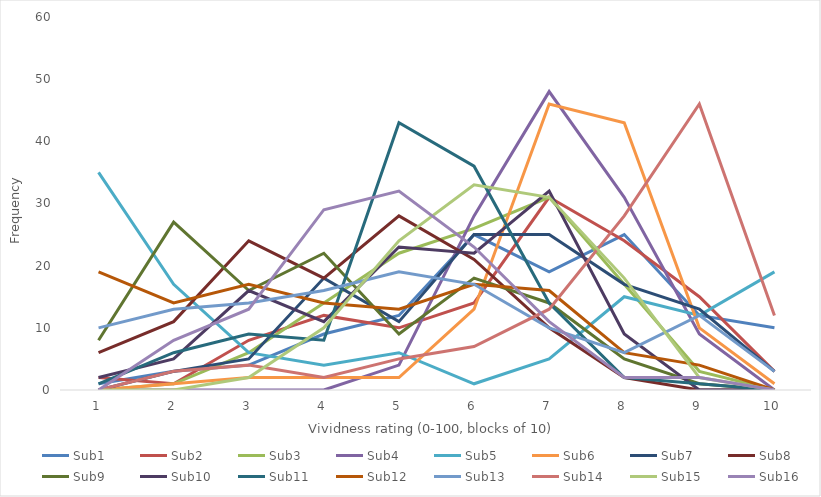
| Category | Sub1 | Sub2 | Sub3 | Sub4 | Sub5 | Sub6 | Sub7 | Sub8 | Sub9 | Sub10 | Sub11 | Sub12 | Sub13 | Sub14 | Sub15 | Sub16 |
|---|---|---|---|---|---|---|---|---|---|---|---|---|---|---|---|---|
| 0 | 1 | 2 | 0 | 0 | 35 | 0 | 0 | 6 | 8 | 2 | 1 | 19 | 10 | 0 | 0 | 0 |
| 1 | 3 | 1 | 1 | 0 | 17 | 1 | 3 | 11 | 27 | 5 | 6 | 14 | 13 | 3 | 0 | 8 |
| 2 | 4 | 8 | 6 | 0 | 6 | 2 | 5 | 24 | 16 | 16 | 9 | 17 | 14 | 4 | 2 | 13 |
| 3 | 9 | 12 | 14 | 0 | 4 | 2 | 18 | 18 | 22 | 11 | 8 | 14 | 16 | 2 | 10 | 29 |
| 4 | 12 | 10 | 22 | 4 | 6 | 2 | 11 | 28 | 9 | 23 | 43 | 13 | 19 | 5 | 24 | 32 |
| 5 | 25 | 14 | 26 | 28 | 1 | 13 | 25 | 21 | 18 | 22 | 36 | 17 | 17 | 7 | 33 | 23 |
| 6 | 19 | 31 | 31 | 48 | 5 | 46 | 25 | 10 | 14 | 32 | 14 | 16 | 10 | 13 | 31 | 11 |
| 7 | 25 | 24 | 17 | 31 | 15 | 43 | 17 | 2 | 5 | 9 | 2 | 6 | 6 | 28 | 18 | 2 |
| 8 | 12 | 15 | 3 | 9 | 12 | 10 | 13 | 0 | 1 | 0 | 1 | 4 | 12 | 46 | 2 | 2 |
| 9 | 10 | 3 | 0 | 0 | 19 | 1 | 3 | 0 | 0 | 0 | 0 | 0 | 3 | 12 | 0 | 0 |